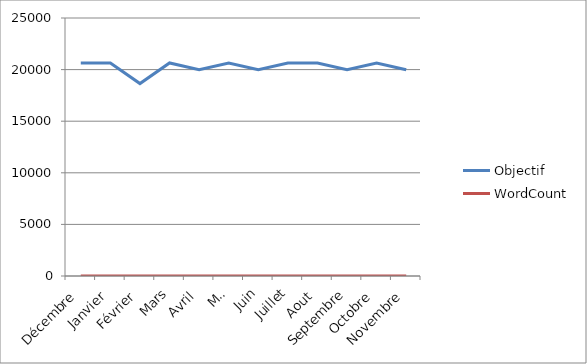
| Category | Objectif | WordCount |
|---|---|---|
| Décembre | 20646 | 0 |
| Janvier | 20646 | 0 |
| Février | 18648 | 0 |
| Mars | 20646 | 0 |
| Avril | 19980 | 0 |
| Mai | 20646 | 0 |
| Juin | 19980 | 0 |
| Juillet | 20646 | 0 |
| Aout | 20646 | 0 |
| Septembre | 19980 | 0 |
| Octobre | 20646 | 0 |
| Novembre | 19980 | 0 |